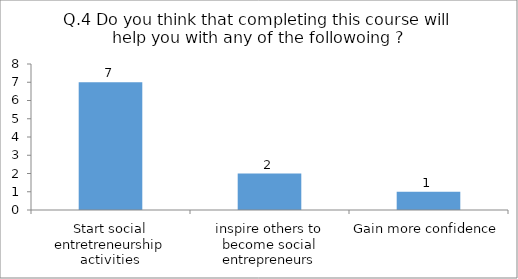
| Category | Q.4 Do you think that completing this course will help you with any of the followoing ? |
|---|---|
| Start social entretreneurship activities | 7 |
| inspire others to become social entrepreneurs | 2 |
| Gain more confidence | 1 |